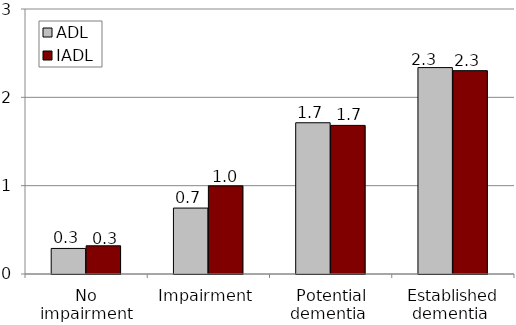
| Category | ADL  | IADL  |
|---|---|---|
| No impairment | 0.289 | 0.319 |
| Impairment | 0.746 | 0.998 |
| Potential dementia  | 1.712 | 1.682 |
| Established dementia  | 2.337 | 2.302 |